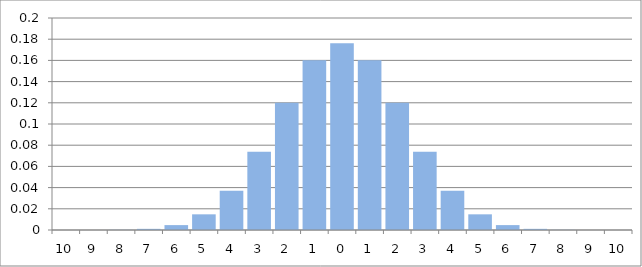
| Category | Series 0 |
|---|---|
| 10.0 | 0 |
| 9.0 | 0 |
| 8.0 | 0 |
| 7.0 | 0.001 |
| 6.0 | 0.005 |
| 5.0 | 0.015 |
| 4.0 | 0.037 |
| 3.0 | 0.074 |
| 2.0 | 0.12 |
| 1.0 | 0.16 |
| 0.0 | 0.176 |
| 1.0 | 0.16 |
| 2.0 | 0.12 |
| 3.0 | 0.074 |
| 4.0 | 0.037 |
| 5.0 | 0.015 |
| 6.0 | 0.005 |
| 7.0 | 0.001 |
| 8.0 | 0 |
| 9.0 | 0 |
| 10.0 | 0 |